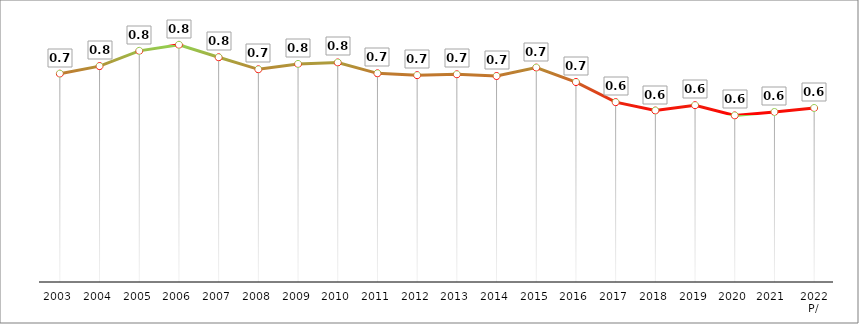
| Category | Participación porcentual |
|---|---|
| 2003 | 0.724 |
| 2004 | 0.75 |
| 2005 | 0.803 |
| 2006 | 0.824 |
| 2007 | 0.781 |
| 2008 | 0.739 |
| 2009 | 0.758 |
| 2010 | 0.763 |
| 2011 | 0.725 |
| 2012 | 0.719 |
| 2013 | 0.722 |
| 2014 | 0.716 |
| 2015 | 0.745 |
| 2016 | 0.695 |
| 2017 | 0.625 |
| 2018 | 0.596 |
| 2019 | 0.614 |
| 2020 | 0.579 |
| 2021  | 0.591 |
| 2022 P/ | 0.605 |